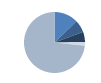
| Category | Series 0 |
|---|---|
| 0 | 180 |
| 1 | 92 |
| 2 | 78 |
| 3 | 26 |
| 4 | 1032 |